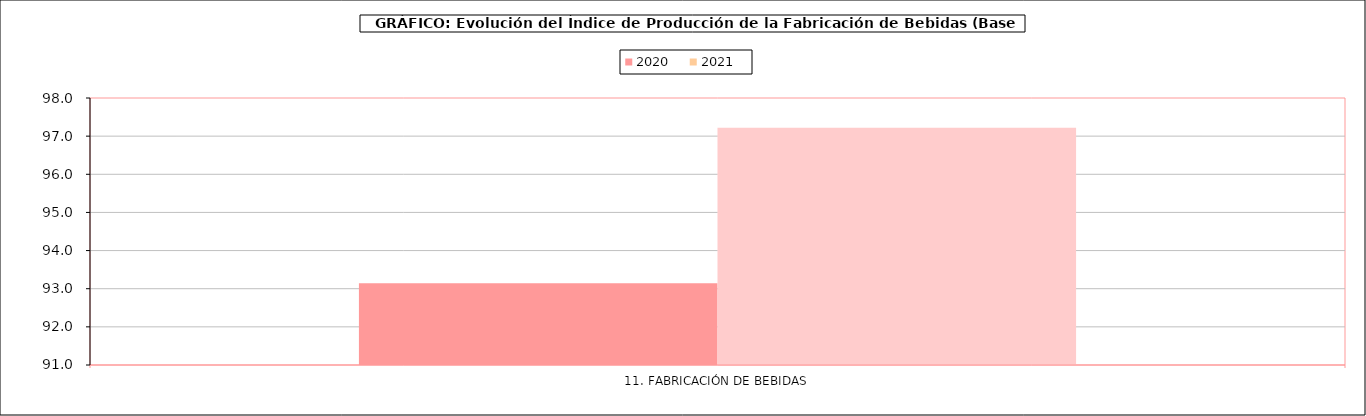
| Category | 2020 | 2021 |
|---|---|---|
| 0 | 93.144 | 97.217 |